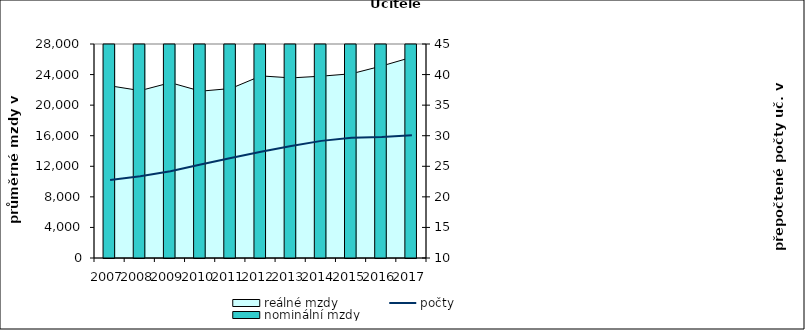
| Category | nominální mzdy |
|---|---|
| 2007.0 | 19216 |
| 2008.0 | 19866.166 |
| 2009.0 | 21036.65 |
| 2010.0 | 20298.604 |
| 2011.0 | 21024.77 |
| 2012.0 | 23326.585 |
| 2013.0 | 23398.844 |
| 2014.0 | 23720.195 |
| 2015.0 | 24108.013 |
| 2016.0 | 25299.673 |
| 2017.0 | 27088.588 |